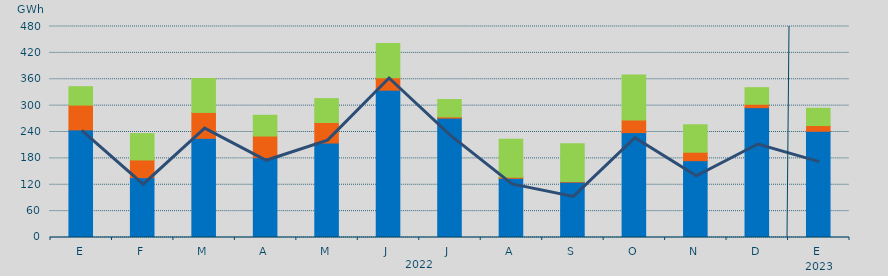
| Category | Asignación SEPE | Asignación Francia | Asignación Portugal |
|---|---|---|---|
| E | 244787.3 | 56434 | 41874.5 |
| F | 136191.8 | 40226.7 | 59973 |
| M | 225622.7 | 58889.7 | 77145.2 |
| A | 181585.4 | 49218 | 47192.7 |
| M | 214905.3 | 46679.2 | 54371.7 |
| J | 335176.8 | 28179 | 77960.7 |
| J | 271567.05 | 2839.1 | 39441.4 |
| A | 134609.35 | 2385 | 86328.9 |
| S | 125828.7 | 1385 | 85885 |
| O | 238619.175 | 28420.1 | 102571.3 |
| N | 174742.7 | 19231.9 | 62469.6 |
| D | 295334.825 | 7715.1 | 37807.2 |
| E | 241649.025 | 13030.5 | 39359.9 |